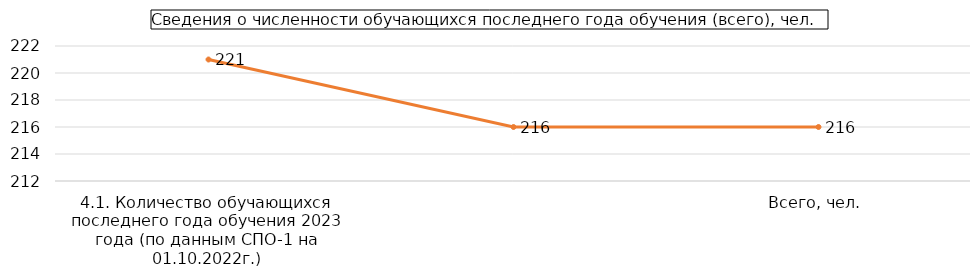
| Category | Series 1 |
|---|---|
| 0 | 221 |
| 1 | 216 |
| 2 | 216 |